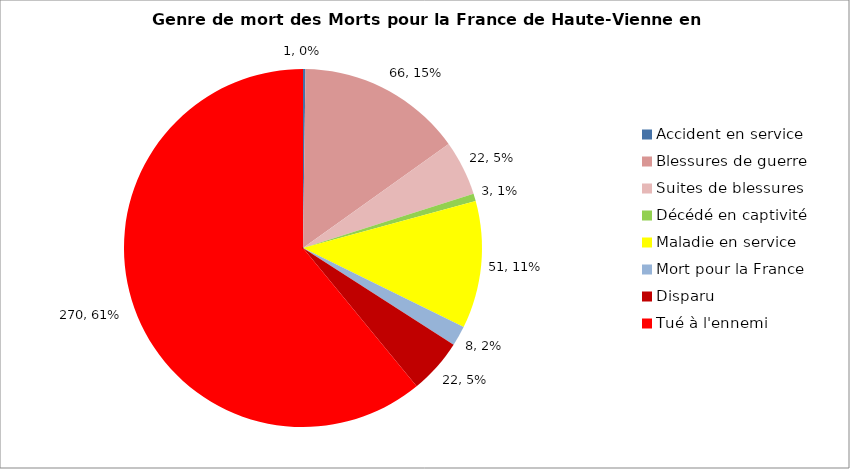
| Category | Genre de mort des Morts pour la France de Haute-Vienne en novembre 1914 |
|---|---|
| Accident en service | 1 |
| Blessures de guerre | 66 |
| Suites de blessures | 22 |
| Décédé en captivité | 3 |
| Maladie en service | 51 |
| Mort pour la France | 8 |
| Disparu | 22 |
| Tué à l'ennemi | 270 |